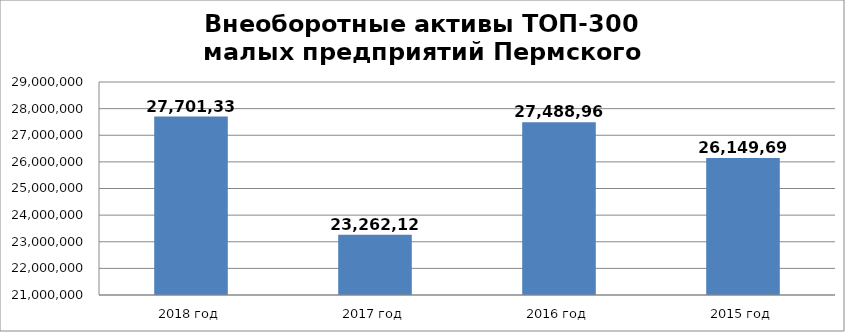
| Category | Series 0 |
|---|---|
| 2018 год | 27701334 |
| 2017 год | 23262120 |
| 2016 год | 27488963 |
| 2015 год | 26149694 |